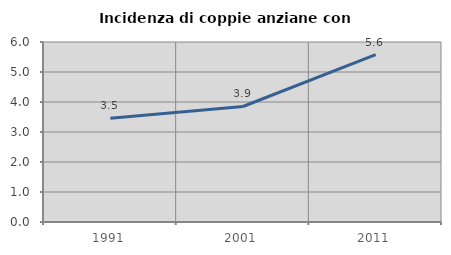
| Category | Incidenza di coppie anziane con figli |
|---|---|
| 1991.0 | 3.456 |
| 2001.0 | 3.851 |
| 2011.0 | 5.579 |